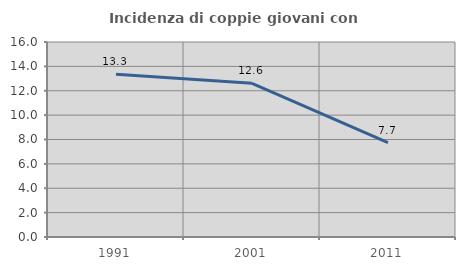
| Category | Incidenza di coppie giovani con figli |
|---|---|
| 1991.0 | 13.344 |
| 2001.0 | 12.615 |
| 2011.0 | 7.744 |